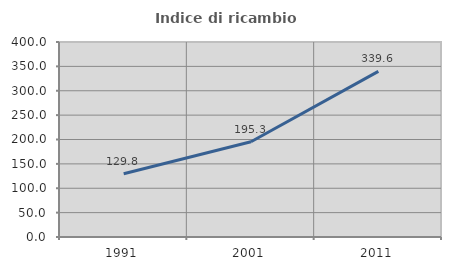
| Category | Indice di ricambio occupazionale  |
|---|---|
| 1991.0 | 129.808 |
| 2001.0 | 195.259 |
| 2011.0 | 339.623 |